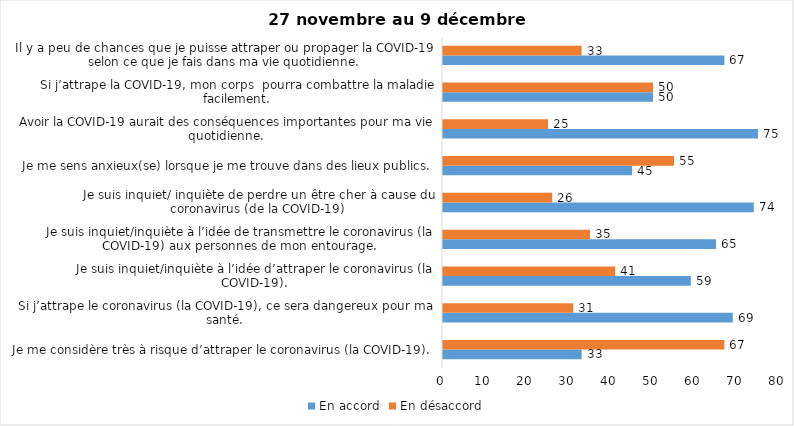
| Category | En accord | En désaccord |
|---|---|---|
| Je me considère très à risque d’attraper le coronavirus (la COVID-19). | 33 | 67 |
| Si j’attrape le coronavirus (la COVID-19), ce sera dangereux pour ma santé. | 69 | 31 |
| Je suis inquiet/inquiète à l’idée d’attraper le coronavirus (la COVID-19). | 59 | 41 |
| Je suis inquiet/inquiète à l’idée de transmettre le coronavirus (la COVID-19) aux personnes de mon entourage. | 65 | 35 |
| Je suis inquiet/ inquiète de perdre un être cher à cause du coronavirus (de la COVID-19) | 74 | 26 |
| Je me sens anxieux(se) lorsque je me trouve dans des lieux publics. | 45 | 55 |
| Avoir la COVID-19 aurait des conséquences importantes pour ma vie quotidienne. | 75 | 25 |
| Si j’attrape la COVID-19, mon corps  pourra combattre la maladie facilement. | 50 | 50 |
| Il y a peu de chances que je puisse attraper ou propager la COVID-19 selon ce que je fais dans ma vie quotidienne. | 67 | 33 |